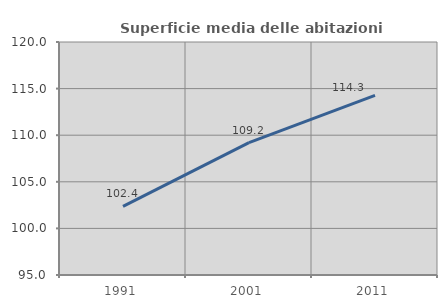
| Category | Superficie media delle abitazioni occupate |
|---|---|
| 1991.0 | 102.371 |
| 2001.0 | 109.209 |
| 2011.0 | 114.279 |